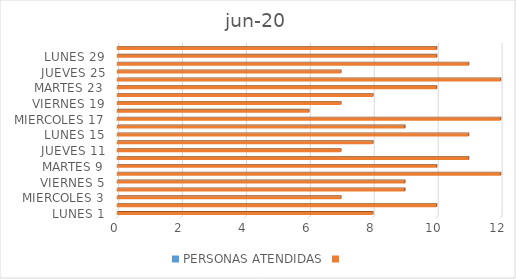
| Category | PERSONAS ATENDIDAS | Series 1 |
|---|---|---|
| LUNES 1 |  | 8 |
| MARTES 2 |  | 10 |
| MIERCOLES 3 |  | 7 |
| JUEVES 4 |  | 9 |
| VIERNES 5 |  | 9 |
| LUNES 8 |  | 12 |
| MARTES 9 |  | 10 |
| MIERCOLES 10 |  | 11 |
| JUEVES 11 |  | 7 |
| VIERNES 12 |  | 8 |
| LUNES 15 |  | 11 |
| MARTES 16 |  | 9 |
| MIERCOLES 17 |  | 12 |
| JUEVES 18 |  | 6 |
| VIERNES 19 |  | 7 |
| LUNES 22 |  | 8 |
| MARTES 23 |  | 10 |
| MIERCOLES 24 |  | 12 |
| JUEVES 25 |  | 7 |
| VIERNES 26 |  | 11 |
| LUNES 29 |  | 10 |
| MARTES 30 |  | 10 |